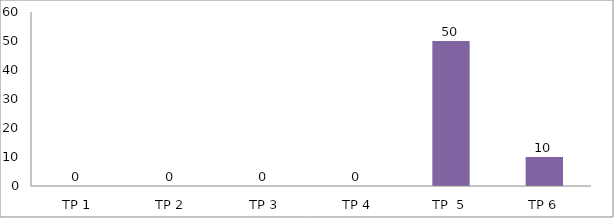
| Category | BIL. MURID |
|---|---|
| TP 1 | 0 |
| TP 2 | 0 |
|  TP 3 | 0 |
| TP 4 | 0 |
| TP  5 | 50 |
| TP 6 | 10 |